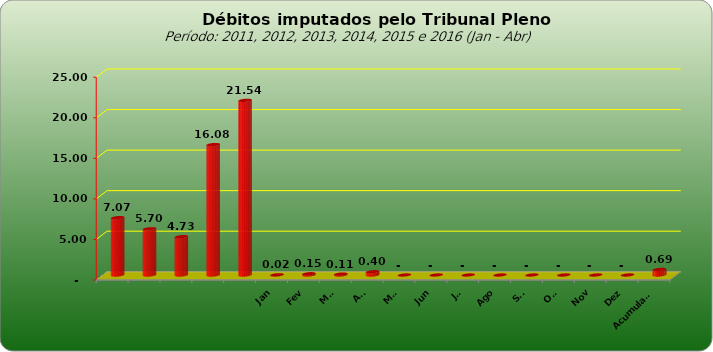
| Category |  7.073.154,74  |
|---|---|
|  | 7073154.74 |
|  | 5698720.25 |
|  | 4727033.51 |
|  | 16081820.48 |
|  | 21535723.6 |
| Jan | 22059.63 |
| Fev | 154318.14 |
| Mar | 112460.95 |
| Abr | 404403.01 |
| Mai | 0 |
| Jun | 0 |
| Jul | 0 |
| Ago | 0 |
| Set | 0 |
| Out | 0 |
| Nov | 0 |
| Dez | 0 |
| Acumulado | 693241.73 |